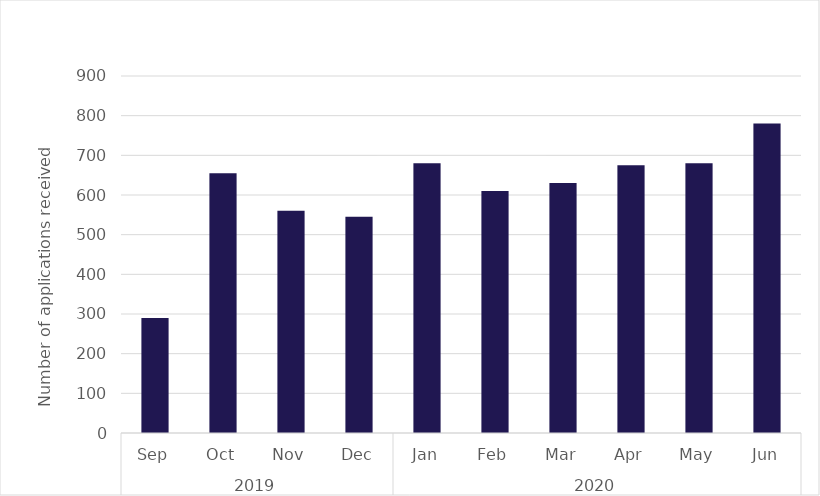
| Category | Series 0 |
|---|---|
| 0 | 290 |
| 1 | 655 |
| 2 | 560 |
| 3 | 545 |
| 4 | 680 |
| 5 | 610 |
| 6 | 630 |
| 7 | 675 |
| 8 | 680 |
| 9 | 780 |